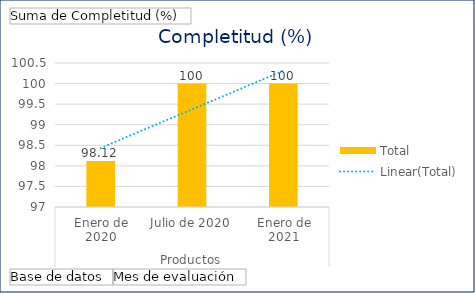
| Category | Total |
|---|---|
| 0 | 98.12 |
| 1 | 100 |
| 2 | 100 |